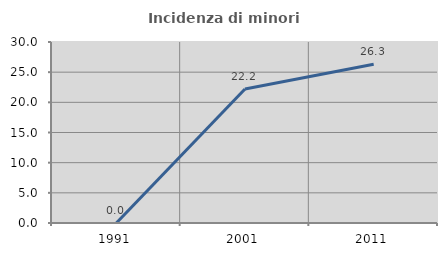
| Category | Incidenza di minori stranieri |
|---|---|
| 1991.0 | 0 |
| 2001.0 | 22.222 |
| 2011.0 | 26.316 |